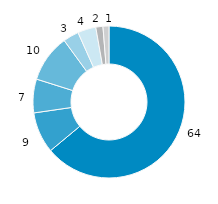
| Category | Brandenburg |
|---|---|
| gesetzliche
Kranken-versicherung | 63.965 |
| private Haushalte u. private Organi-sationen o. E. | 8.742 |
| private
Kranken-versicherung | 7.172 |
| soziale Pflegeversicherung | 10.109 |
| öffentliche Haushalte | 3.35 |
| Arbeitgeber | 3.88 |
| gesetzliche Unfallversicherung | 1.521 |
| gesetzliche
Renten-
versicherung | 1.271 |